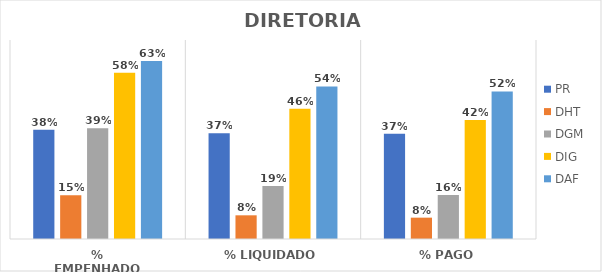
| Category | PR | DHT | DGM | DIG | DAF |
|---|---|---|---|---|---|
| % EMPENHADO | 0.384 | 0.154 | 0.389 | 0.585 | 0.626 |
| % LIQUIDADO | 0.372 | 0.083 | 0.187 | 0.458 | 0.537 |
| % PAGO | 0.37 | 0.075 | 0.155 | 0.419 | 0.519 |